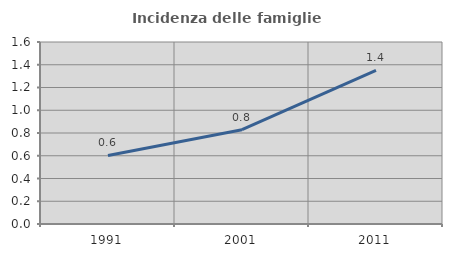
| Category | Incidenza delle famiglie numerose |
|---|---|
| 1991.0 | 0.602 |
| 2001.0 | 0.829 |
| 2011.0 | 1.351 |